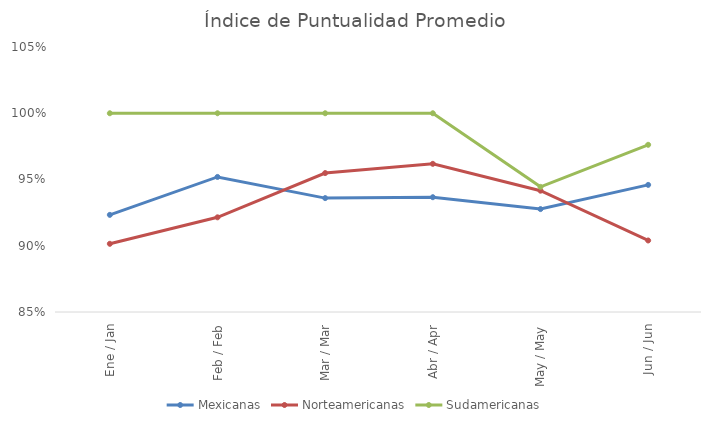
| Category | Mexicanas | Norteamericanas | Sudamericanas |
|---|---|---|---|
| Ene / Jan | 0.923 | 0.901 | 1 |
| Feb / Feb | 0.952 | 0.921 | 1 |
| Mar / Mar | 0.936 | 0.955 | 1 |
| Abr / Apr | 0.937 | 0.962 | 1 |
| May / May | 0.928 | 0.942 | 0.944 |
| Jun / Jun | 0.946 | 0.904 | 0.976 |